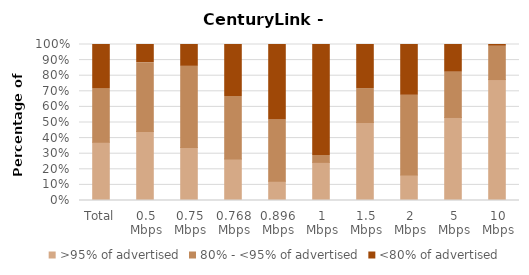
| Category | >95% of advertised | 80% - <95% of advertised | <80% of advertised |
|---|---|---|---|
| Total | 0.373 | 0.345 | 0.282 |
| 0.5 Mbps | 0.442 | 0.442 | 0.116 |
| 0.75 Mbps | 0.34 | 0.52 | 0.14 |
| 0.768 Mbps | 0.267 | 0.4 | 0.333 |
| 0.896 Mbps | 0.124 | 0.392 | 0.485 |
| 1 Mbps | 0.244 | 0.044 | 0.711 |
| 1.5 Mbps | 0.5 | 0.217 | 0.283 |
| 2 Mbps | 0.163 | 0.512 | 0.326 |
| 5 Mbps | 0.532 | 0.29 | 0.177 |
| 10 Mbps | 0.775 | 0.213 | 0.011 |